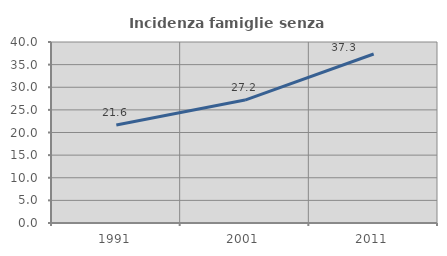
| Category | Incidenza famiglie senza nuclei |
|---|---|
| 1991.0 | 21.638 |
| 2001.0 | 27.165 |
| 2011.0 | 37.346 |